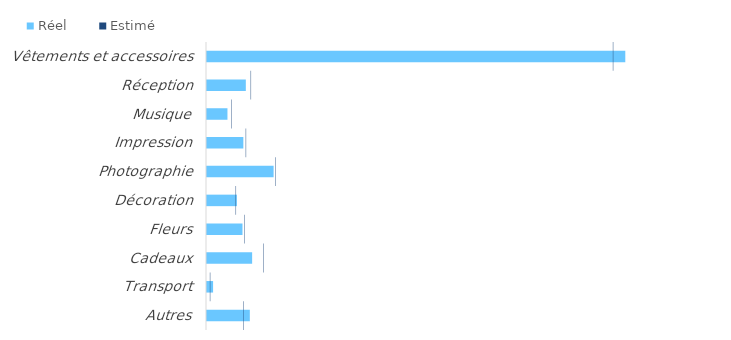
| Category | Réel |
|---|---|
| Vêtements et accessoires | 9770 |
| Réception | 928 |
| Musique | 500 |
| Impression | 870 |
| Photographie | 1575 |
| Décoration | 720 |
| Fleurs | 850 |
| Cadeaux | 1075 |
| Transport | 165 |
| Autres | 1021 |